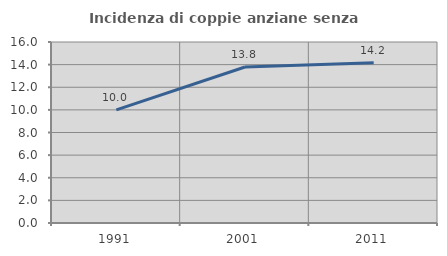
| Category | Incidenza di coppie anziane senza figli  |
|---|---|
| 1991.0 | 10 |
| 2001.0 | 13.793 |
| 2011.0 | 14.169 |